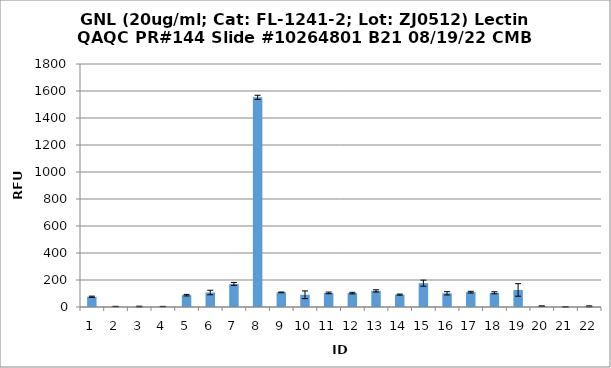
| Category | Series 0 |
|---|---|
| 0 | 75.75 |
| 1 | 3.5 |
| 2 | 3.25 |
| 3 | 3.5 |
| 4 | 87.5 |
| 5 | 107.25 |
| 6 | 170.75 |
| 7 | 1553.25 |
| 8 | 108.25 |
| 9 | 90.5 |
| 10 | 104.5 |
| 11 | 103 |
| 12 | 119.25 |
| 13 | 91.75 |
| 14 | 176.5 |
| 15 | 101.25 |
| 16 | 110 |
| 17 | 105.25 |
| 18 | 126.5 |
| 19 | 6.5 |
| 20 | 1 |
| 21 | 4.5 |